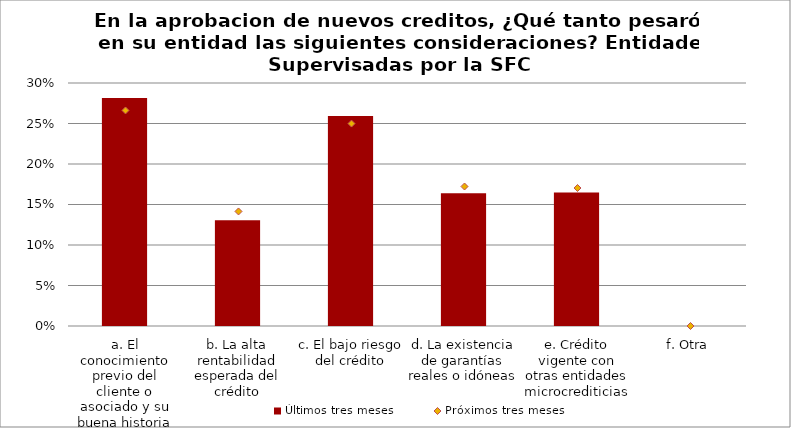
| Category | Últimos tres meses |
|---|---|
| a. El conocimiento previo del cliente o asociado y su buena historia de crédito | 0.281 |
| b. La alta rentabilidad esperada del crédito | 0.131 |
| c. El bajo riesgo del crédito | 0.259 |
| d. La existencia de garantías reales o idóneas | 0.164 |
| e. Crédito vigente con otras entidades microcrediticias | 0.165 |
| f. Otra | 0 |